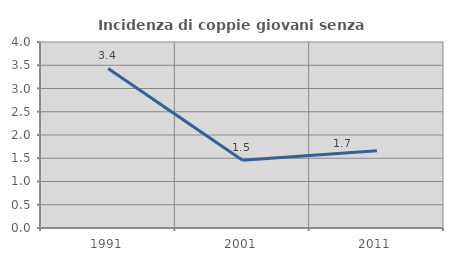
| Category | Incidenza di coppie giovani senza figli |
|---|---|
| 1991.0 | 3.431 |
| 2001.0 | 1.456 |
| 2011.0 | 1.66 |